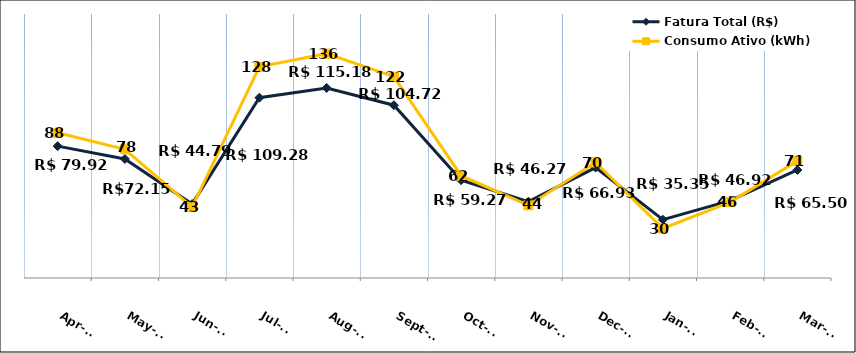
| Category | Fatura Total (R$) |
|---|---|
| 2023-04-01 | 79.92 |
| 2023-05-01 | 72.15 |
| 2023-06-01 | 44.79 |
| 2023-07-01 | 109.28 |
| 2023-08-01 | 115.18 |
| 2023-09-01 | 104.72 |
| 2023-10-01 | 59.27 |
| 2023-11-01 | 46.27 |
| 2023-12-01 | 66.93 |
| 2024-01-01 | 35.35 |
| 2024-02-01 | 46.92 |
| 2024-03-01 | 65.5 |